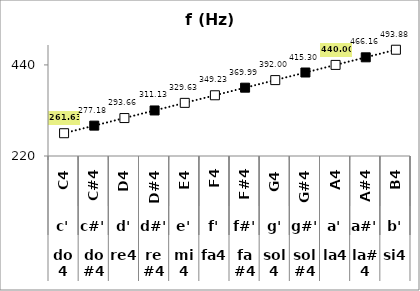
| Category | f (Hz) |
|---|---|
| 0 | 261.626 |
| 1 | 277.183 |
| 2 | 293.665 |
| 3 | 311.127 |
| 4 | 329.628 |
| 5 | 349.228 |
| 6 | 369.994 |
| 7 | 391.995 |
| 8 | 415.305 |
| 9 | 440 |
| 10 | 466.164 |
| 11 | 493.883 |